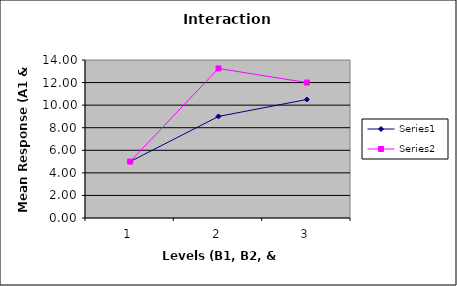
| Category | Series 0 | Series 1 |
|---|---|---|
| 0 | 5 | 5 |
| 1 | 9 | 13.25 |
| 2 | 10.5 | 12 |